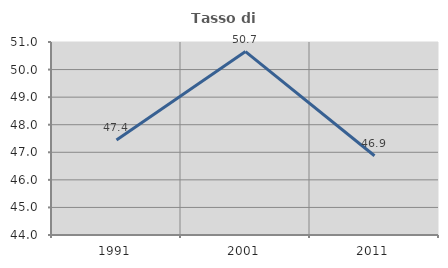
| Category | Tasso di occupazione   |
|---|---|
| 1991.0 | 47.448 |
| 2001.0 | 50.652 |
| 2011.0 | 46.875 |